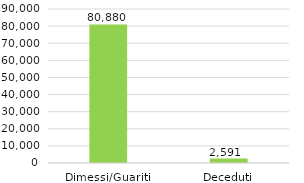
| Category | Abruzzo |
|---|---|
| Dimessi/Guariti | 80880 |
| Deceduti | 2591 |